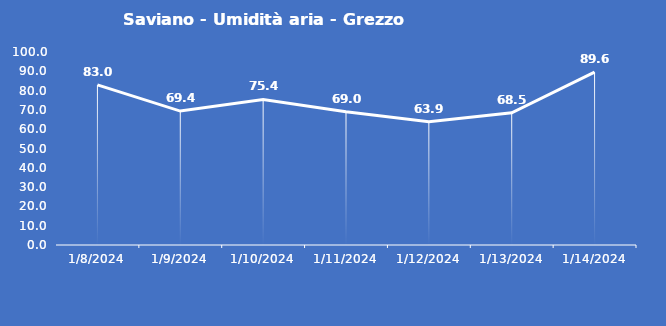
| Category | Saviano - Umidità aria - Grezzo (%) |
|---|---|
| 1/8/24 | 83 |
| 1/9/24 | 69.4 |
| 1/10/24 | 75.4 |
| 1/11/24 | 69 |
| 1/12/24 | 63.9 |
| 1/13/24 | 68.5 |
| 1/14/24 | 89.6 |